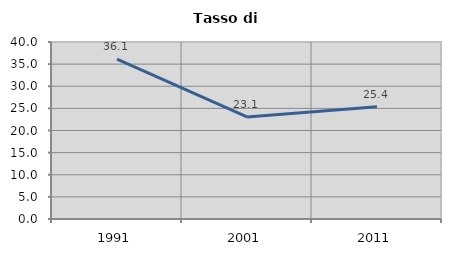
| Category | Tasso di disoccupazione   |
|---|---|
| 1991.0 | 36.118 |
| 2001.0 | 23.077 |
| 2011.0 | 25.364 |